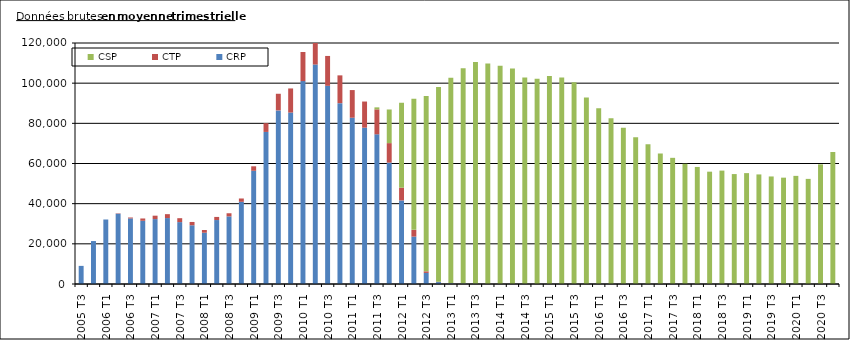
| Category | CRP | CTP | CSP |
|---|---|---|---|
| 2005 T3 | 9020.333 | 0 | 0 |
| 2005 T4 | 21381.333 | 0 | 0 |
| 2006 T1 | 32117.333 | 0 | 0 |
| 2006 T2 | 35008 | 179 | 0 |
| 2006 T3 | 32656.667 | 447.333 | 0 |
| 2006 T4 | 31477 | 1149.667 | 0 |
| 2007 T1 | 32323.333 | 1694.667 | 0 |
| 2007 T2 | 32829.667 | 1949.667 | 0 |
| 2007 T3 | 30817 | 1949.333 | 0 |
| 2007 T4 | 29235.333 | 1653.667 | 0 |
| 2008 T1 | 25532.333 | 1357.667 | 0 |
| 2008 T2 | 31844 | 1551 | 0 |
| 2008 T3 | 33666 | 1562.333 | 0 |
| 2008 T4 | 40932.667 | 1646.333 | 0 |
| 2009 T1 | 56376 | 2227.333 | 0 |
| 2009 T2 | 75718.667 | 4353.667 | 0 |
| 2009 T3 | 86444.333 | 8279.667 | 0 |
| 2009 T4 | 85371 | 11998.333 | 0 |
| 2010 T1 | 101027.667 | 14493 | 0 |
| 2010 T2 | 109272.333 | 15334 | 0 |
| 2010 T3 | 98681.333 | 14871.333 | 0 |
| 2010 T4 | 90039 | 13845 | 0 |
| 2011 T1 | 82795.333 | 13769.667 | 0 |
| 2011 T2 | 77832.667 | 13020.667 | 0 |
| 2011 T3 | 74531 | 12426.667 | 999 |
| 2011 T4 | 60446 | 9703.667 | 16744.667 |
| 2012 T1 | 41607.667 | 6354.667 | 42285.667 |
| 2012 T2 | 23601 | 3366.667 | 65263.333 |
| 2012 T3 | 5506 | 807.333 | 87294.667 |
| 2012 T4 | 954 | 145.333 | 96972.667 |
| 2013 T1 | 367.333 | 35 | 102347.333 |
| 2013 T2 | 183 | 13.667 | 107219 |
| 2013 T3 | 74.667 | 7.333 | 110419.667 |
| 2013 T4 | 52 | 3.667 | 109729 |
| 2014 T1 | 33 | 2 | 108675 |
| 2014 T2 | 10.667 | 1.667 | 107247.333 |
| 2014 T3 | 11 | 0 | 102861.667 |
| 2014 T4 | 7 | 0 | 102240.333 |
| 2015 T1 | 3.667 | 0 | 103504 |
| 2015 T2 | 4.667 | 0 | 102836.333 |
| 2015 T3 | 0 | 0 | 100473 |
| 2015 T4 | 0 | 0 | 92883.333 |
| 2016 T1 | 0 | 0 | 87538.333 |
| 2016 T2 | 0 | 0 | 82509.667 |
| 2016 T3 | 0 | 0 | 77795 |
| 2016 T4 | 0 | 0 | 73012 |
| 2017 T1 | 0 | 0 | 69626.333 |
| 2017 T2 | 0 | 0 | 65034.667 |
| 2017 T3 | 0 | 0 | 62821 |
| 2017 T4 | 0 | 0 | 59879.667 |
| 2018 T1 | 0 | 0 | 58279.667 |
| 2018 T2 | 0 | 0 | 55930 |
| 2018 T3 | 0 | 0 | 56466 |
| 2018 T4 | 0 | 0 | 54738 |
| 2019 T1 | 0 | 0 | 55210.333 |
| 2019 T2 | 0 | 0 | 54560.333 |
| 2019 T3 | 0 | 0 | 53548.333 |
| 2019 T4 | 0 | 0 | 52950 |
| 2020 T1 | 0 | 0 | 53840.333 |
| 2020 T2 | 0 | 0 | 52341.667 |
| 2020 T3 | 0 | 0 | 59578 |
| 2020 T4 | 0 | 0 | 65695.667 |